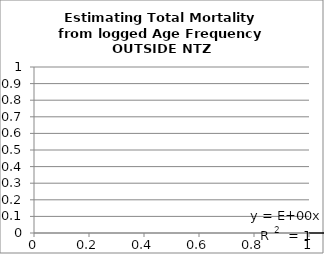
| Category | Series 0 |
|---|---|
| 0 | 0 |
| 1 | 0 |
| 2 | 0 |
| 3 | 0 |
| 4 | 0 |
| 5 | 0 |
| 6 | 0 |
| 7 | 0 |
| 8 | 0 |
| 9 | 0 |
| 10 | 0 |